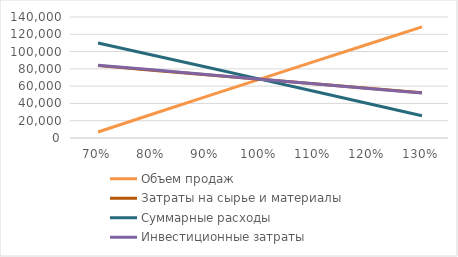
| Category | Объем продаж | Затраты на сырье и материалы | Суммарные расходы | Инвестиционные затраты |
|---|---|---|---|---|
| 0.7 | 6987.226 | 83739.307 | 109873.319 | 84222.938 |
| 0.8 | 27499.105 | 78495.801 | 95987.317 | 78847.938 |
| 0.9 | 47826.462 | 73313.456 | 82055.673 | 73472.938 |
| 1.0 | 68097.938 | 68097.938 | 68097.938 | 68097.938 |
| 1.1 | 88297.046 | 62849.843 | 54088.178 | 62722.938 |
| 1.2 | 108517.127 | 57666.372 | 40001.689 | 57347.938 |
| 1.3 | 128642.659 | 52441.099 | 25826.464 | 51972.938 |